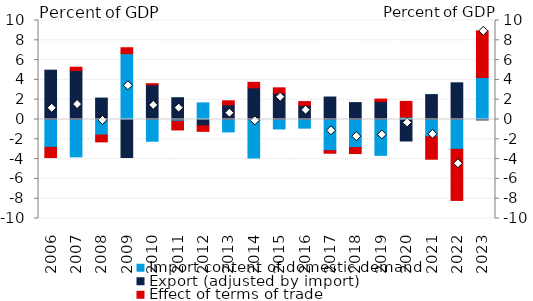
| Category | Import content of domestic demand | Export (adjusted by import) | Effect of terms of trade |
|---|---|---|---|
| 2006.0 | -2.818 | 4.983 | -1.03 |
| 2007.0 | -3.772 | 4.944 | 0.337 |
| 2008.0 | -1.569 | 2.164 | -0.692 |
| 2009.0 | 6.651 | -3.839 | 0.599 |
| 2010.0 | -2.196 | 3.504 | 0.114 |
| 2011.0 | -0.179 | 2.202 | -0.876 |
| 2012.0 | 1.676 | -0.635 | -0.562 |
| 2013.0 | -1.252 | 1.481 | 0.409 |
| 2014.0 | -3.891 | 3.198 | 0.554 |
| 2015.0 | -0.957 | 2.649 | 0.55 |
| 2016.0 | -0.874 | 1.415 | 0.397 |
| 2017.0 | -3.149 | 2.27 | -0.259 |
| 2018.0 | -2.828 | 1.706 | -0.612 |
| 2019.0 | -3.622 | 1.819 | 0.243 |
| 2020.0 | 0.243 | -2.171 | 1.584 |
| 2021.0 | -1.739 | 2.515 | -2.273 |
| 2022.0 | -3.013 | 3.705 | -5.162 |
| 2023.0 | 4.238 | -0.044 | 4.707 |